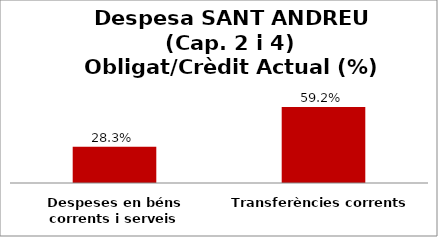
| Category | Series 0 |
|---|---|
| Despeses en béns corrents i serveis | 0.283 |
| Transferències corrents | 0.592 |